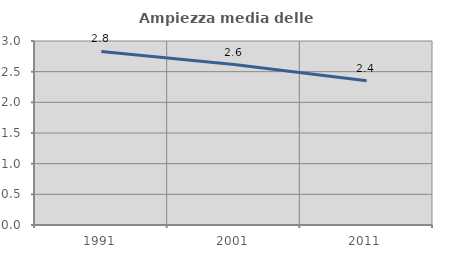
| Category | Ampiezza media delle famiglie |
|---|---|
| 1991.0 | 2.83 |
| 2001.0 | 2.615 |
| 2011.0 | 2.351 |